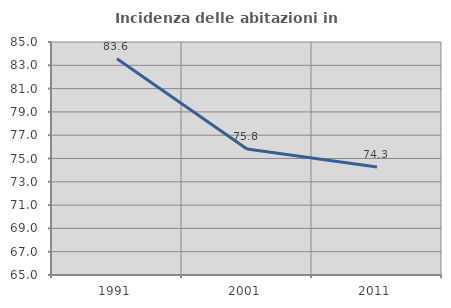
| Category | Incidenza delle abitazioni in proprietà  |
|---|---|
| 1991.0 | 83.56 |
| 2001.0 | 75.816 |
| 2011.0 | 74.262 |